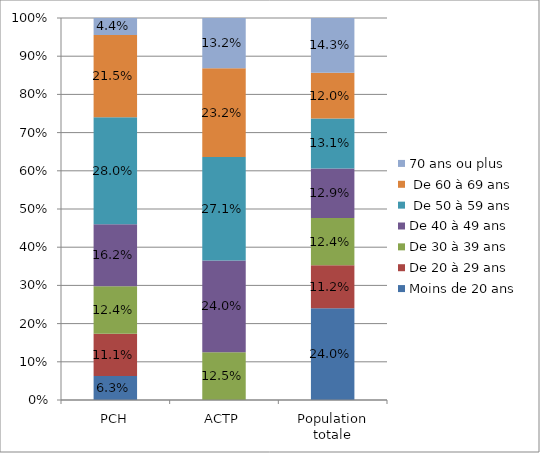
| Category | Moins de 20 ans  | De 20 à 29 ans | De 30 à 39 ans | De 40 à 49 ans |  De 50 à 59 ans |  De 60 à 69 ans | 70 ans ou plus |
|---|---|---|---|---|---|---|---|
| PCH | 0.063 | 0.111 | 0.124 | 0.162 | 0.28 | 0.215 | 0.044 |
| ACTP | 0 | 0 | 0.125 | 0.24 | 0.271 | 0.232 | 0.132 |
| Population totale | 0.24 | 0.112 | 0.124 | 0.129 | 0.131 | 0.12 | 0.143 |